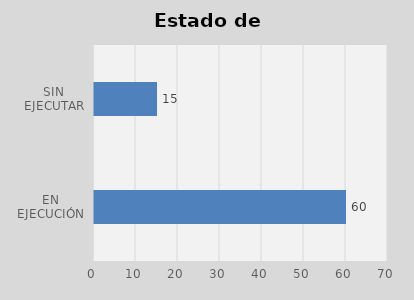
| Category | Total |
|---|---|
| EN EJECUCIÓN | 60 |
| SIN EJECUTAR | 15 |